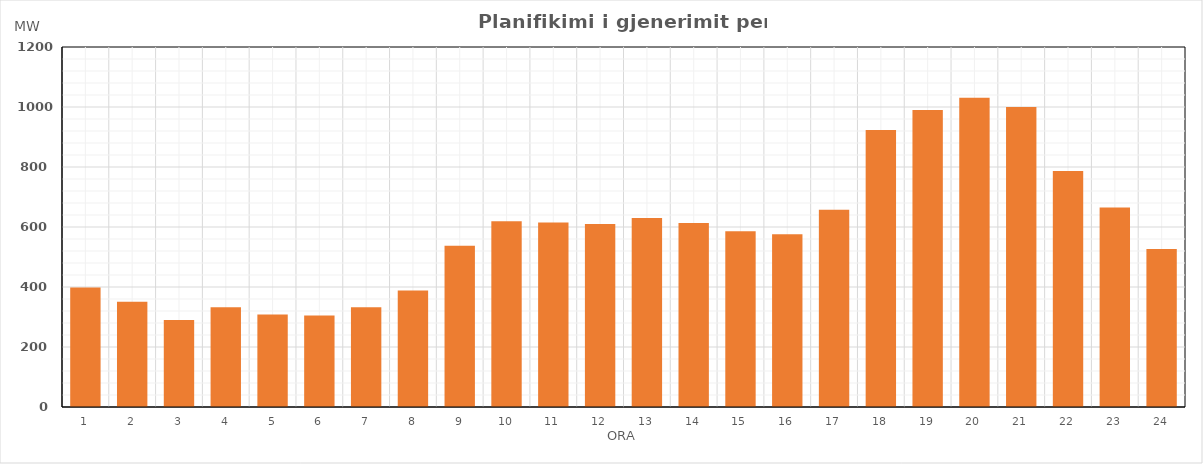
| Category | Max (MW) |
|---|---|
| 0 | 398.006 |
| 1 | 350.901 |
| 2 | 289.902 |
| 3 | 332.862 |
| 4 | 308.349 |
| 5 | 304.614 |
| 6 | 332.507 |
| 7 | 388.204 |
| 8 | 537.158 |
| 9 | 619.099 |
| 10 | 615.214 |
| 11 | 610.41 |
| 12 | 629.982 |
| 13 | 612.919 |
| 14 | 585.975 |
| 15 | 575.893 |
| 16 | 657.716 |
| 17 | 923.242 |
| 18 | 990.166 |
| 19 | 1030.515 |
| 20 | 999.932 |
| 21 | 786.988 |
| 22 | 665.346 |
| 23 | 526.404 |